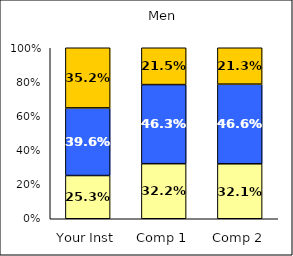
| Category | Low Academic Self-Concept | Average Academic Self-Concept | High Academic Self-Concept |
|---|---|---|---|
| Your Inst | 0.253 | 0.396 | 0.352 |
| Comp 1 | 0.322 | 0.463 | 0.215 |
| Comp 2 | 0.321 | 0.466 | 0.213 |